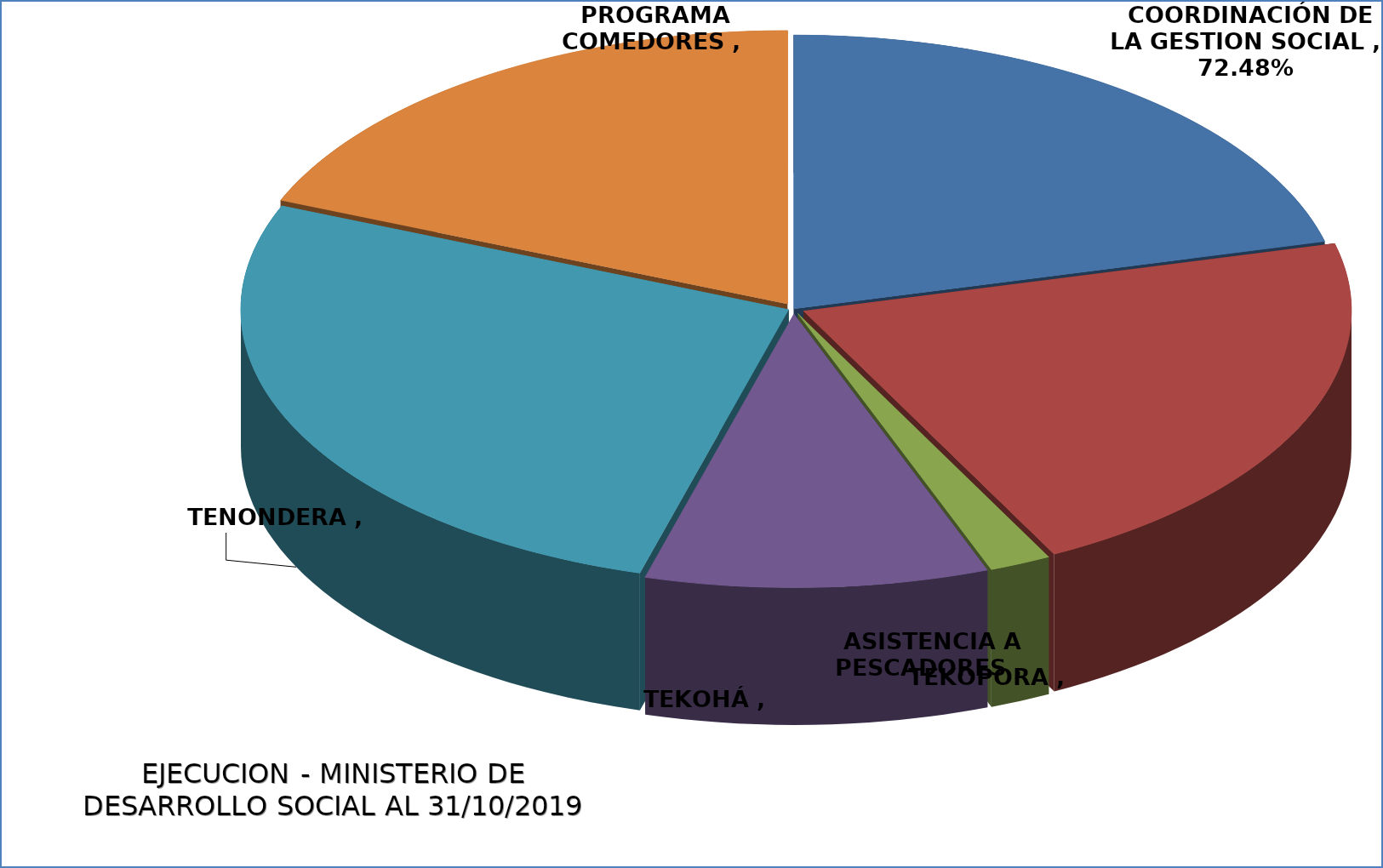
| Category | EJECUCIÓN - MINISTERIO DE DESARROLLO SOCIAL |
|---|---|
| COORDINACIÓN DE LA GESTION SOCIAL | 0.725 |
| TEKOPORA | 0.737 |
| ASISTENCIA A PESCADORES | 0.063 |
| TEKOHÁ | 0.349 |
| TENONDERA | 0.924 |
| PROGRAMA COMEDORES | 0.648 |